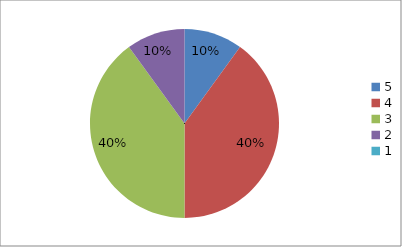
| Category | Series 0 | Series 1 |
|---|---|---|
| 5.0 | 10 | 10 |
| 4.0 | 40 | 40 |
| 3.0 | 40 | 40 |
| 2.0 | 10 | 10 |
| 1.0 | 0 | 0 |